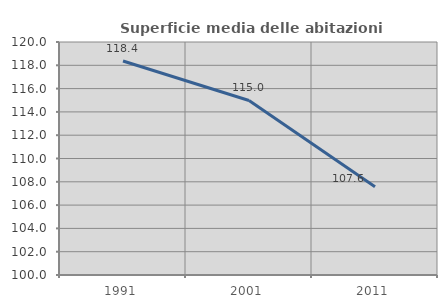
| Category | Superficie media delle abitazioni occupate |
|---|---|
| 1991.0 | 118.37 |
| 2001.0 | 114.979 |
| 2011.0 | 107.567 |